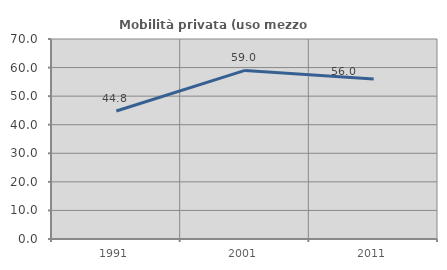
| Category | Mobilità privata (uso mezzo privato) |
|---|---|
| 1991.0 | 44.809 |
| 2001.0 | 59.016 |
| 2011.0 | 56.019 |